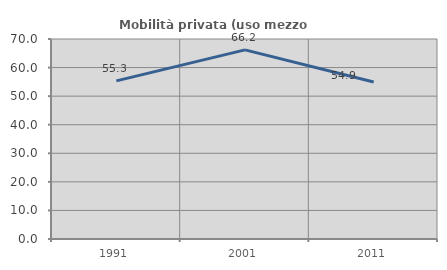
| Category | Mobilità privata (uso mezzo privato) |
|---|---|
| 1991.0 | 55.344 |
| 2001.0 | 66.202 |
| 2011.0 | 54.948 |